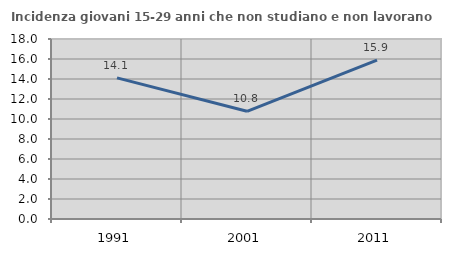
| Category | Incidenza giovani 15-29 anni che non studiano e non lavorano  |
|---|---|
| 1991.0 | 14.109 |
| 2001.0 | 10.769 |
| 2011.0 | 15.882 |